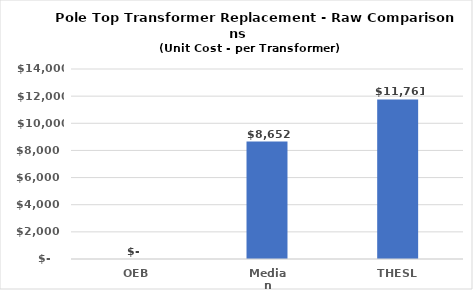
| Category | Series 0 |
|---|---|
| OEB | 0 |
| Median | 8651.905 |
| THESL | 11761 |